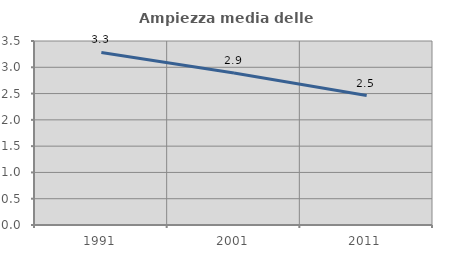
| Category | Ampiezza media delle famiglie |
|---|---|
| 1991.0 | 3.283 |
| 2001.0 | 2.891 |
| 2011.0 | 2.463 |